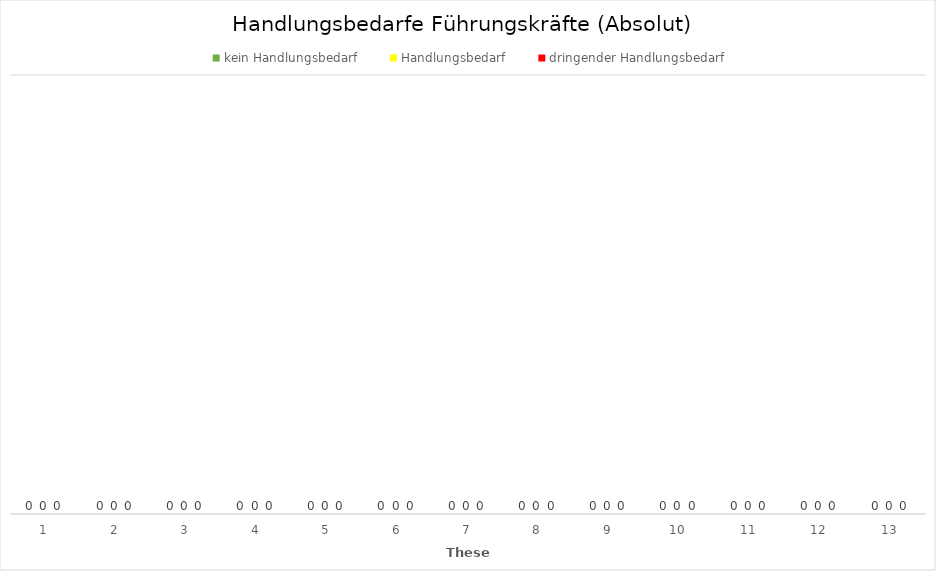
| Category | kein Handlungsbedarf | Handlungsbedarf | dringender Handlungsbedarf |
|---|---|---|---|
| 1.0 | 0 | 0 | 0 |
| 2.0 | 0 | 0 | 0 |
| 3.0 | 0 | 0 | 0 |
| 4.0 | 0 | 0 | 0 |
| 5.0 | 0 | 0 | 0 |
| 6.0 | 0 | 0 | 0 |
| 7.0 | 0 | 0 | 0 |
| 8.0 | 0 | 0 | 0 |
| 9.0 | 0 | 0 | 0 |
| 10.0 | 0 | 0 | 0 |
| 11.0 | 0 | 0 | 0 |
| 12.0 | 0 | 0 | 0 |
| 13.0 | 0 | 0 | 0 |